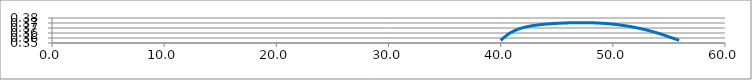
| Category | Series 0 |
|---|---|
| 40.0001 | 0.355 |
| 40.7975 | 0.362 |
| 41.5937 | 0.366 |
| 42.3894 | 0.368 |
| 43.1847 | 0.37 |
| 43.98 | 0.371 |
| 44.7752 | 0.371 |
| 45.5704 | 0.372 |
| 46.3656 | 0.372 |
| 47.1608 | 0.372 |
| 47.9561 | 0.372 |
| 48.7514 | 0.372 |
| 49.5466 | 0.371 |
| 50.3419 | 0.37 |
| 51.1372 | 0.369 |
| 51.9325 | 0.368 |
| 52.7278 | 0.366 |
| 53.5231 | 0.363 |
| 54.3184 | 0.361 |
| 55.1137 | 0.358 |
| 55.909 | 0.355 |